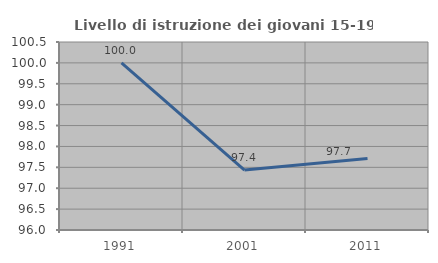
| Category | Livello di istruzione dei giovani 15-19 anni |
|---|---|
| 1991.0 | 100 |
| 2001.0 | 97.436 |
| 2011.0 | 97.71 |